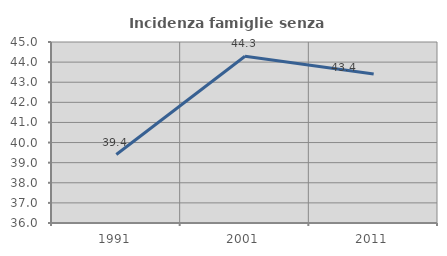
| Category | Incidenza famiglie senza nuclei |
|---|---|
| 1991.0 | 39.403 |
| 2001.0 | 44.293 |
| 2011.0 | 43.407 |